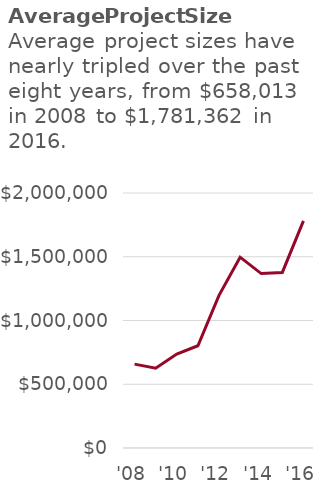
| Category | Average Project Size |
|---|---|
| '08 | 658013.143 |
| '09 | 625675.429 |
| '10 | 736632.077 |
| '11 | 801947.833 |
| '12 | 1197027.125 |
| '13 | 1496841 |
| '14 | 1368031 |
| '15 | 1376937.714 |
| '16 | 1781361.6 |